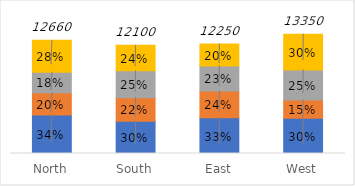
| Category | Apple | Orange | Grape | Pear |
|---|---|---|---|---|
| North | 4300 | 2500 | 2300 | 3560 |
| South | 3600 | 2650 | 3000 | 2850 |
| East | 4000 | 3000 | 2800 | 2450 |
| West | 3950 | 2050 | 3350 | 4000 |